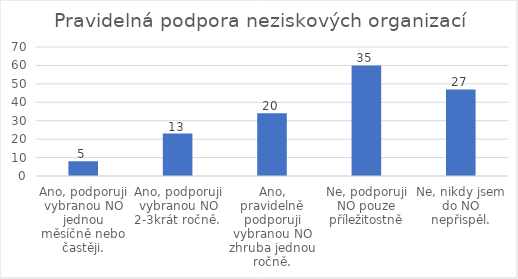
| Category | Počet respondentů |
|---|---|
| Ano, podporuji vybranou NO jednou měsíčně nebo častěji. | 8 |
| Ano, podporuji vybranou NO 2-3krát ročně.  | 23 |
| Ano, pravidelně podporuji vybranou NO zhruba jednou ročně. | 34 |
| Ne, podporuji NO pouze příležitostně | 60 |
| Ne, nikdy jsem do NO nepřispěl. | 47 |